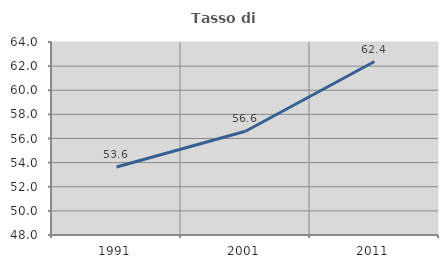
| Category | Tasso di occupazione   |
|---|---|
| 1991.0 | 53.64 |
| 2001.0 | 56.598 |
| 2011.0 | 62.38 |